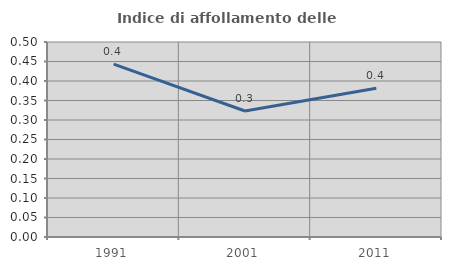
| Category | Indice di affollamento delle abitazioni  |
|---|---|
| 1991.0 | 0.443 |
| 2001.0 | 0.323 |
| 2011.0 | 0.381 |